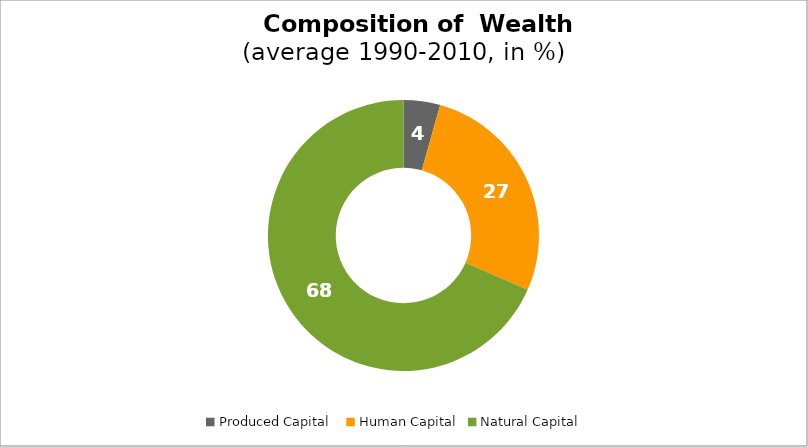
| Category | Series 0 |
|---|---|
| Produced Capital  | 4.36 |
| Human Capital | 27.211 |
| Natural Capital | 68.428 |